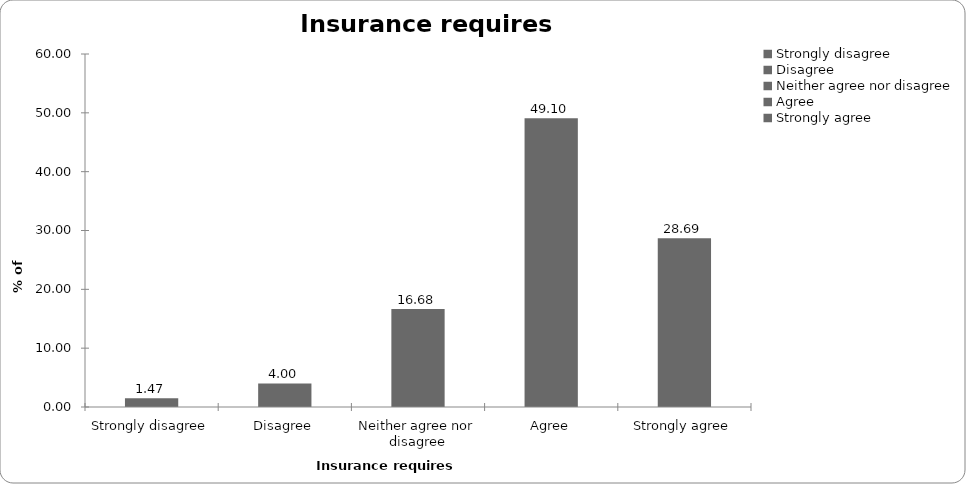
| Category | Insurance requires regulation |
|---|---|
| Strongly disagree | 1.468 |
| Disagree | 4.003 |
| Neither agree nor disagree | 16.678 |
| Agree | 49.099 |
| Strongly agree | 28.686 |